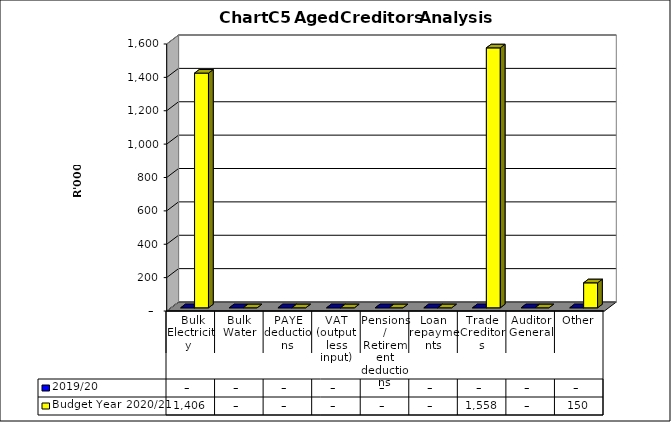
| Category | 2019/20 | Budget Year 2020/21 |
|---|---|---|
|  Bulk Electricity  | 0 | 1406400 |
| Bulk Water | 0 | 0 |
| PAYE deductions | 0 | 0 |
| VAT (output less input) | 0 | 0 |
| Pensions / Retirement deductions | 0 | 0 |
| Loan repayments | 0 | 0 |
| Trade Creditors | 0 | 1557543 |
| Auditor General | 0 | 0 |
| Other | 0 | 149665 |